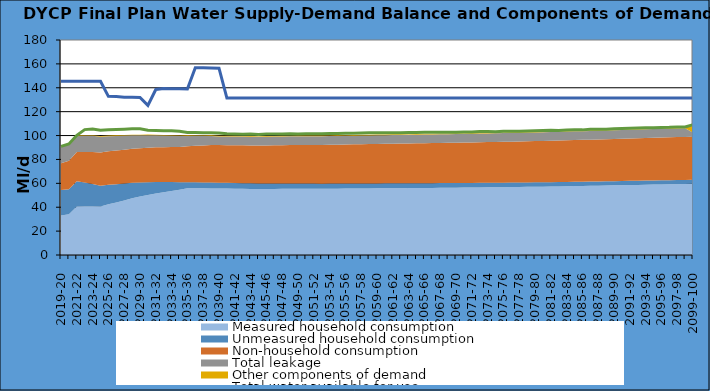
| Category | Total water available for use | Total demand + target headroom (final plan) |
|---|---|---|
| 0 | 145.38 | 90.94 |
| 1 | 145.38 | 92.984 |
| 2 | 145.38 | 100.244 |
| 3 | 145.38 | 104.965 |
| 4 | 145.38 | 105.495 |
| 5 | 145.38 | 104.478 |
| 6 | 132.828 | 104.953 |
| 7 | 132.68 | 105.058 |
| 8 | 132.172 | 105.301 |
| 9 | 132.024 | 105.649 |
| 10 | 131.876 | 105.639 |
| 11 | 125.238 | 104.434 |
| 12 | 138.57 | 104.276 |
| 13 | 139.423 | 104.051 |
| 14 | 139.275 | 103.928 |
| 15 | 139.127 | 103.586 |
| 16 | 138.979 | 102.517 |
| 17 | 156.831 | 102.483 |
| 18 | 156.683 | 102.378 |
| 19 | 156.535 | 102.318 |
| 20 | 156.387 | 102.169 |
| 21 | 131.35 | 101.491 |
| 22 | 131.35 | 101.307 |
| 23 | 131.35 | 101.098 |
| 24 | 131.35 | 101.225 |
| 25 | 131.35 | 100.957 |
| 26 | 131.35 | 101.264 |
| 27 | 131.35 | 101.328 |
| 28 | 131.35 | 101.383 |
| 29 | 131.35 | 101.539 |
| 30 | 131.35 | 101.306 |
| 31 | 131.35 | 101.58 |
| 32 | 131.35 | 101.56 |
| 33 | 131.35 | 101.581 |
| 34 | 131.35 | 101.718 |
| 35 | 131.35 | 101.724 |
| 36 | 131.35 | 101.965 |
| 37 | 131.35 | 102.002 |
| 38 | 131.35 | 102.065 |
| 39 | 131.35 | 102.262 |
| 40 | 131.35 | 102.252 |
| 41 | 131.35 | 102.335 |
| 42 | 131.35 | 102.335 |
| 43 | 131.35 | 102.382 |
| 44 | 131.35 | 102.646 |
| 45 | 131.35 | 102.509 |
| 46 | 131.35 | 102.737 |
| 47 | 131.35 | 102.716 |
| 48 | 131.35 | 102.863 |
| 49 | 131.35 | 102.833 |
| 50 | 131.35 | 102.681 |
| 51 | 131.35 | 103.067 |
| 52 | 131.35 | 103.044 |
| 53 | 131.35 | 103.309 |
| 54 | 131.35 | 103.427 |
| 55 | 131.35 | 103.287 |
| 56 | 131.35 | 103.689 |
| 57 | 131.35 | 103.568 |
| 58 | 131.35 | 103.685 |
| 59 | 131.35 | 103.856 |
| 60 | 131.35 | 104.115 |
| 61 | 131.35 | 104.244 |
| 62 | 131.35 | 104.366 |
| 63 | 131.35 | 104.331 |
| 64 | 131.35 | 104.741 |
| 65 | 131.35 | 104.791 |
| 66 | 131.35 | 104.757 |
| 67 | 131.35 | 105.218 |
| 68 | 131.35 | 105.321 |
| 69 | 131.35 | 105.342 |
| 70 | 131.35 | 105.675 |
| 71 | 131.35 | 105.984 |
| 72 | 131.35 | 106.179 |
| 73 | 131.35 | 106.286 |
| 74 | 131.35 | 106.441 |
| 75 | 131.35 | 106.45 |
| 76 | 131.35 | 106.815 |
| 77 | 131.35 | 106.92 |
| 78 | 131.35 | 107.177 |
| 79 | 131.35 | 107.211 |
| 80 | 131.35 | 109.099 |